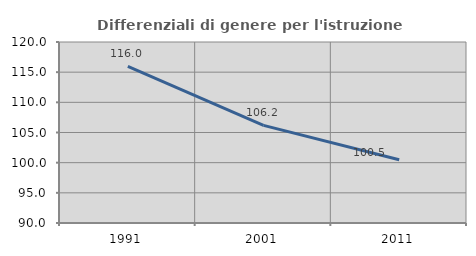
| Category | Differenziali di genere per l'istruzione superiore |
|---|---|
| 1991.0 | 115.955 |
| 2001.0 | 106.185 |
| 2011.0 | 100.482 |